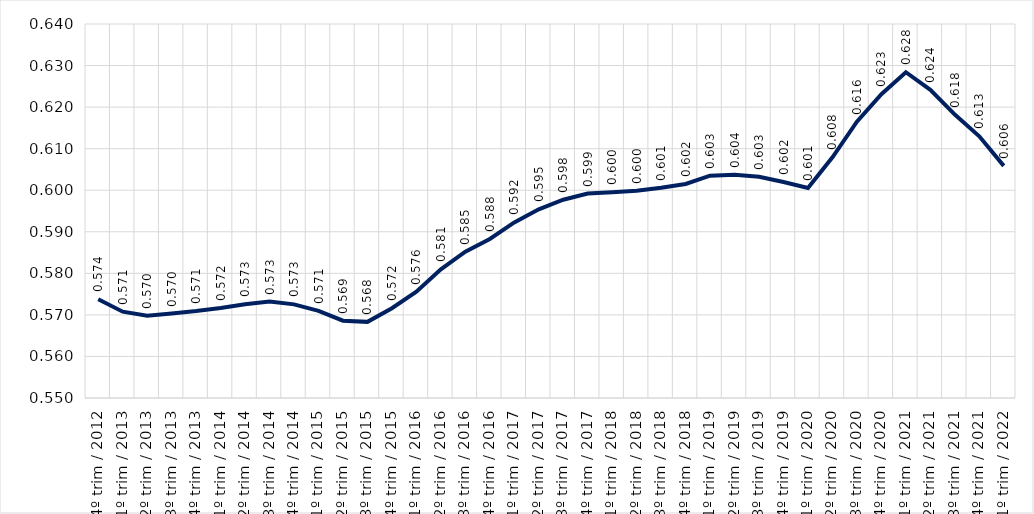
| Category | Média conjunto RMs |
|---|---|
| 4º trim / 2012 | 0.574 |
| 1º trim / 2013 | 0.571 |
| 2º trim / 2013 | 0.57 |
| 3º trim / 2013 | 0.57 |
| 4º trim / 2013 | 0.571 |
| 1º trim / 2014 | 0.572 |
| 2º trim / 2014 | 0.573 |
| 3º trim / 2014 | 0.573 |
| 4º trim / 2014 | 0.573 |
| 1º trim / 2015 | 0.571 |
| 2º trim / 2015 | 0.569 |
| 3º trim / 2015 | 0.568 |
| 4º trim / 2015 | 0.572 |
| 1º trim / 2016 | 0.576 |
| 2º trim / 2016 | 0.581 |
| 3º trim / 2016 | 0.585 |
| 4º trim / 2016 | 0.588 |
| 1º trim / 2017 | 0.592 |
| 2º trim / 2017 | 0.595 |
| 3º trim / 2017 | 0.598 |
| 4º trim / 2017 | 0.599 |
| 1º trim / 2018 | 0.6 |
| 2º trim / 2018 | 0.6 |
| 3º trim / 2018 | 0.601 |
| 4º trim / 2018 | 0.602 |
| 1º trim / 2019 | 0.603 |
| 2º trim / 2019 | 0.604 |
| 3º trim / 2019 | 0.603 |
| 4º trim / 2019 | 0.602 |
| 1º trim / 2020 | 0.601 |
| 2º trim / 2020 | 0.608 |
| 3º trim / 2020 | 0.616 |
| 4º trim / 2020 | 0.623 |
| 1º trim / 2021 | 0.628 |
| 2º trim / 2021 | 0.624 |
| 3º trim / 2021 | 0.618 |
| 4º trim / 2021 | 0.613 |
| 1º trim / 2022 | 0.606 |